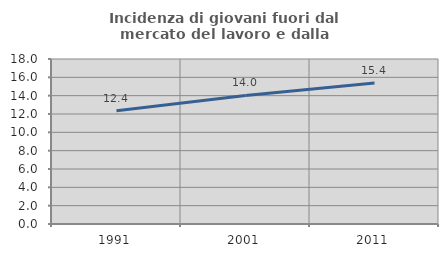
| Category | Incidenza di giovani fuori dal mercato del lavoro e dalla formazione  |
|---|---|
| 1991.0 | 12.364 |
| 2001.0 | 14.027 |
| 2011.0 | 15.385 |